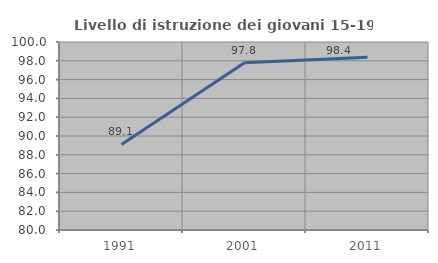
| Category | Livello di istruzione dei giovani 15-19 anni |
|---|---|
| 1991.0 | 89.096 |
| 2001.0 | 97.805 |
| 2011.0 | 98.368 |